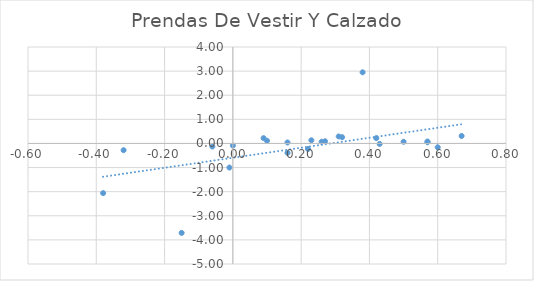
| Category | Prendas De Vestir Y Calzado |
|---|---|
| 0.38 | 2.95 |
| -0.15 | -3.71 |
| -0.06 | -0.13 |
| 0.32 | 0.26 |
| -0.01 | -1 |
| 0.0 | -0.09 |
| -0.38 | -2.06 |
| -0.32 | -0.28 |
| 0.16 | -0.39 |
| 0.57 | 0.05 |
| 0.67 | 0.31 |
| 0.42 | 0.22 |
| 0.26 | 0.07 |
| 0.1 | 0.11 |
| 0.16 | 0.04 |
| 0.23 | 0.13 |
| 0.09 | 0.22 |
| 0.22 | -0.23 |
| 0.27 | 0.09 |
| 0.31 | 0.29 |
| 0.5 | 0.07 |
| 0.43 | -0.02 |
| 0.57 | 0.08 |
| 0.6 | -0.16 |